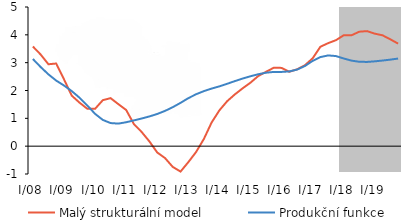
| Category | Malý strukturální model | Produkční funkce |
|---|---|---|
| I/08 | 3.581 | 3.132 |
| II | 3.292 | 2.843 |
| III | 2.943 | 2.58 |
| IV | 2.969 | 2.356 |
| I/09 | 2.403 | 2.18 |
| II | 1.816 | 1.979 |
| III | 1.564 | 1.74 |
| IV | 1.344 | 1.462 |
| I/10 | 1.341 | 1.161 |
| II | 1.653 | 0.943 |
| III | 1.725 | 0.83 |
| IV | 1.509 | 0.811 |
| I/11 | 1.302 | 0.859 |
| II | 0.793 | 0.926 |
| III | 0.508 | 0.994 |
| IV | 0.169 | 1.068 |
| I/12 | -0.227 | 1.156 |
| II | -0.427 | 1.267 |
| III | -0.745 | 1.401 |
| IV | -0.913 | 1.556 |
| I/13 | -0.576 | 1.724 |
| II | -0.21 | 1.865 |
| III | 0.256 | 1.978 |
| IV | 0.85 | 2.069 |
| I/14 | 1.286 | 2.149 |
| II | 1.616 | 2.241 |
| III | 1.862 | 2.339 |
| IV | 2.08 | 2.43 |
| I/15 | 2.281 | 2.511 |
| II | 2.52 | 2.584 |
| III | 2.672 | 2.64 |
| IV | 2.817 | 2.668 |
| I/16 | 2.812 | 2.667 |
| II | 2.673 | 2.686 |
| III | 2.762 | 2.75 |
| IV | 2.906 | 2.879 |
| I/17 | 3.156 | 3.063 |
| II | 3.572 | 3.201 |
| III | 3.702 | 3.26 |
| IV | 3.808 | 3.237 |
| I/18 | 3.984 | 3.15 |
| II | 3.984 | 3.073 |
| III | 4.113 | 3.032 |
| IV | 4.133 | 3.027 |
| I/19 | 4.042 | 3.048 |
| II | 3.982 | 3.076 |
| III | 3.838 | 3.109 |
| IV | 3.684 | 3.148 |